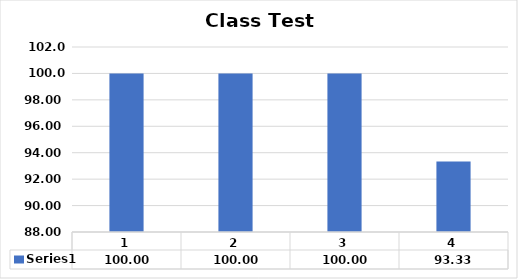
| Category | Series 0 |
|---|---|
| 0 | 100 |
| 1 | 100 |
| 2 | 100 |
| 3 | 93.333 |